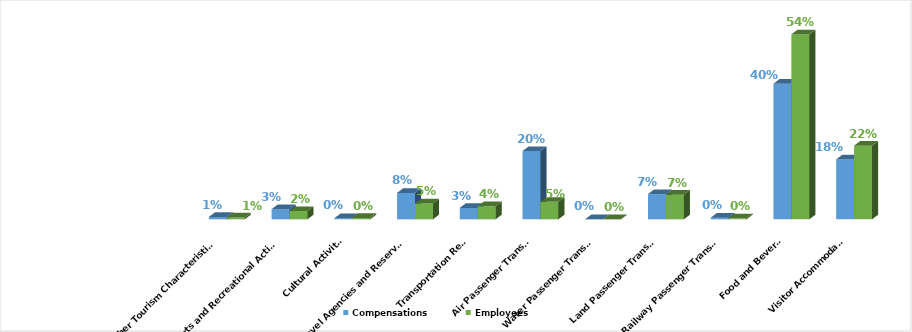
| Category | Compensations | Employees |
|---|---|---|
| Visitor Accommodation | 0.175 | 0.215 |
| Food and Beverage | 0.396 | 0.54 |
| Railway Passenger Transport | 0.005 | 0.003 |
| Land Passenger Transport | 0.074 | 0.072 |
| Water Passenger Transport | 0.001 | 0.001 |
| Air Passenger Transport | 0.199 | 0.051 |
| Transportation Rental | 0.033 | 0.038 |
| Travel Agencies and Reservation Services  | 0.077 | 0.046 |
| Cultural Activities | 0.003 | 0.004 |
| Sports and Recreational Activities | 0.03 | 0.024 |
| Other Tourism Characteristic Services | 0.007 | 0.005 |